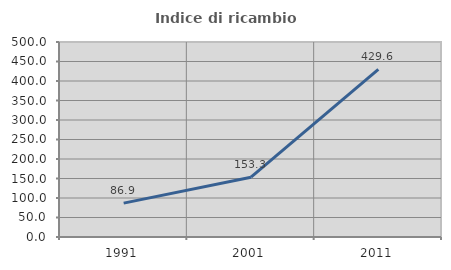
| Category | Indice di ricambio occupazionale  |
|---|---|
| 1991.0 | 86.885 |
| 2001.0 | 153.333 |
| 2011.0 | 429.63 |